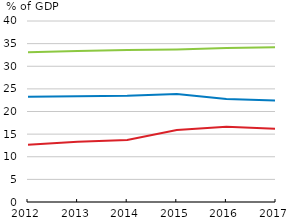
| Category | MEX | LAC | OAVG |
|---|---|---|---|
| 2012.0 | 12.649 | 23.262 | 33.068 |
| 2013.0 | 13.304 | 23.378 | 33.358 |
| 2014.0 | 13.704 | 23.493 | 33.595 |
| 2015.0 | 15.933 | 23.878 | 33.723 |
| 2016.0 | 16.634 | 22.744 | 34.032 |
| 2017.0 | 16.174 | 22.397 | 34.192 |